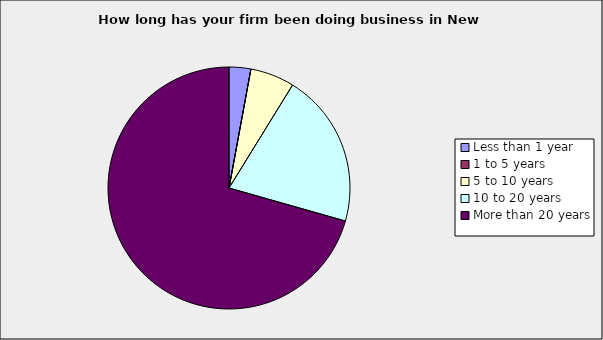
| Category | Series 0 |
|---|---|
| Less than 1 year | 0.029 |
| 1 to 5 years | 0 |
| 5 to 10 years | 0.059 |
| 10 to 20 years | 0.206 |
| More than 20 years | 0.706 |